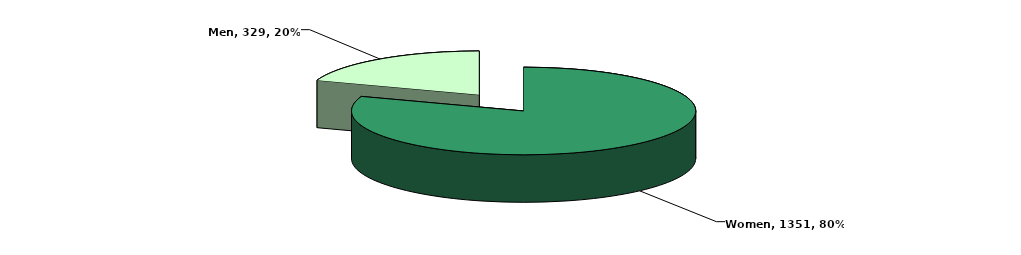
| Category | Series 0 |
|---|---|
| Women | 1351 |
| Men | 329 |